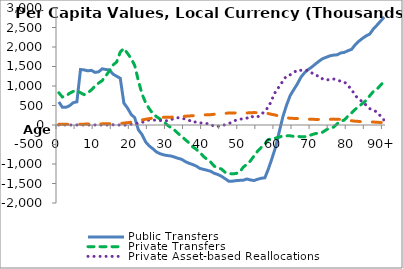
| Category | Public Transfers | Private Transfers | Private Asset-based Reallocations | Public Asset-based Reallocations |
|---|---|---|---|---|
| 0 | 591510.745 | 827219.091 | 1228.666 | 19265.979 |
|  | 453438.7 | 717622.594 | 949.947 | 18915.52 |
| 2 | 453441.687 | 745146.262 | 1680.346 | 18565.062 |
| 3 | 496251.539 | 815200.626 | 458.988 | 18569.931 |
| 4 | 573425.384 | 862192.798 | -521.039 | 19034.452 |
| 5 | 594321.881 | 872118.874 | 733.826 | 19688.412 |
| 6 | 1423202.572 | 828054.936 | 1423.179 | 20755.468 |
| 7 | 1412835.969 | 777860.551 | 1323.464 | 22152.055 |
| 8 | 1389034.735 | 826885.591 | 1103.481 | 23550.649 |
| 9 | 1401688.899 | 898584.385 | 1303.364 | 24806.159 |
| 10 | 1349345.191 | 996393.827 | 1678.179 | 26003.47 |
| 11 | 1363174.714 | 1075064.393 | 1464.291 | 27374.295 |
| 12 | 1440010.84 | 1138079.403 | 1002.726 | 28863.767 |
| 13 | 1423648.635 | 1259800.192 | 1477.637 | 30517.386 |
| 14 | 1411134.992 | 1389021.705 | 1778.967 | 32228.867 |
| 15 | 1303995.743 | 1538645.946 | 5637.399 | 34118.607 |
| 16 | 1249918.46 | 1615219.515 | -600.751 | 35954.27 |
| 17 | 1196814.453 | 1870752.507 | 953.216 | 40655.926 |
| 18 | 561288.224 | 1962478.87 | -7631.971 | 48994.54 |
| 19 | 435698.447 | 1836969.939 | 7771.545 | 59619.875 |
| 20 | 273894.974 | 1707030.205 | 23935.672 | 72928.651 |
| 21 | 184674.938 | 1525168.446 | 22928.021 | 91057.534 |
| 22 | -119870.314 | 1137733.633 | 51701.324 | 109721.519 |
| 23 | -243612.508 | 798774.48 | 69521.944 | 129054.666 |
| 24 | -432844.753 | 574353.492 | 94279.846 | 147141.815 |
| 25 | -535557.997 | 417659.941 | 130933.053 | 163180.956 |
| 26 | -608219.359 | 294793.349 | 123778.489 | 176127.634 |
| 27 | -690808.6 | 215152.782 | 126643.966 | 185474.415 |
| 28 | -735781.725 | 153220.193 | 112243.536 | 191401.584 |
| 29 | -765245.301 | 80438.547 | 124336.676 | 196172.775 |
| 30 | -782950.198 | -562.515 | 104556.697 | 199111.784 |
| 31 | -794443.423 | -65938.484 | 135255.328 | 201103.909 |
| 32 | -822476.818 | -130236.727 | 173229.023 | 205697.058 |
| 33 | -854071.445 | -216720.883 | 185332.888 | 210886.165 |
| 34 | -880788.116 | -293408.357 | 177194.608 | 215305.158 |
| 35 | -938618.683 | -377107.717 | 150797.504 | 224531.819 |
| 36 | -980786.667 | -456064.403 | 123812.944 | 231588.055 |
| 37 | -1012714.061 | -556964.456 | 68266.228 | 236823.831 |
| 38 | -1052236.098 | -620619.471 | 80048.337 | 243189.093 |
| 39 | -1112262.909 | -703707.248 | 50309.776 | 252663.137 |
| 40 | -1137229.565 | -803799.687 | 55471.264 | 257527.719 |
| 41 | -1159839.488 | -881321.888 | 34659.892 | 261151.06 |
| 42 | -1186883.566 | -952057.537 | 16463.408 | 265609.437 |
| 43 | -1239132.471 | -1056038.564 | -36077.398 | 274447.063 |
| 44 | -1269621.02 | -1097929.409 | -34557.969 | 280044.829 |
| 45 | -1315967.071 | -1129592 | -16105.367 | 287841.771 |
| 46 | -1376290.555 | -1211991.962 | 7238.246 | 297910.608 |
| 47 | -1441049.409 | -1246058.119 | 37666.017 | 308777.004 |
| 48 | -1440470.438 | -1253588.181 | 72523.364 | 310361.687 |
| 49 | -1427020.946 | -1243334.871 | 124959.58 | 309944.909 |
| 50 | -1419802.361 | -1211450.734 | 147810.618 | 310650.971 |
| 51 | -1415885.749 | -1083484.09 | 160640.791 | 311719.087 |
| 52 | -1384961.116 | -1008429.402 | 173489.213 | 308770.16 |
| 53 | -1408469.222 | -920554.806 | 233191.985 | 314254.479 |
| 54 | -1423395.647 | -791888.429 | 195640.259 | 318438.085 |
| 55 | -1391141.27 | -668783.821 | 211177.593 | 315566.744 |
| 56 | -1364859.199 | -573070.738 | 260378.041 | 314487.302 |
| 57 | -1353557.046 | -484553.046 | 372212.883 | 314709.141 |
| 58 | -1120005.963 | -369356.225 | 455301.689 | 291561.826 |
| 59 | -846452.385 | -362792.388 | 666246.19 | 271295.121 |
| 60 | -555275.014 | -334013.245 | 866740.723 | 253717.936 |
| 61 | -160577.292 | -311505.991 | 988422.821 | 223376.917 |
| 62 | 218653.822 | -279692.586 | 1130844.748 | 197754.387 |
| 63 | 509760.403 | -278446.776 | 1261646.076 | 184054.456 |
| 64 | 756045.622 | -277112.226 | 1287186.419 | 172739.204 |
| 65 | 908379.672 | -292281.217 | 1347185.804 | 168874.307 |
| 66 | 1055909.851 | -291669.536 | 1411813.486 | 164480.952 |
| 67 | 1230551.84 | -302259.118 | 1401141.421 | 157762.716 |
| 68 | 1342220.632 | -302527.696 | 1406942.676 | 153470.745 |
| 69 | 1422746.313 | -280386.326 | 1397716.797 | 149033.886 |
| 70 | 1488922.1 | -248262.169 | 1334050.433 | 146312.535 |
| 71 | 1565069.181 | -218745.193 | 1268514.889 | 143247.506 |
| 72 | 1638362.078 | -205766.913 | 1258308.634 | 143196.327 |
| 73 | 1701669.886 | -182913.592 | 1176755.109 | 144942.339 |
| 74 | 1737604.046 | -121269.72 | 1152594.701 | 147254.368 |
| 75 | 1774958.899 | -76055.999 | 1169367.217 | 146862.869 |
| 76 | 1791800.752 | -55075.416 | 1180451.33 | 150861.946 |
| 77 | 1799917.082 | 30790.937 | 1152833.688 | 149023.196 |
| 78 | 1848077.5 | 98960.076 | 1121127.352 | 140352.56 |
| 79 | 1862191.615 | 129047.311 | 1103617.273 | 135187.498 |
| 80 | 1906030.783 | 231023.963 | 1007626.378 | 120874.321 |
| 81 | 1941112.147 | 311236.952 | 910396.013 | 108513.604 |
| 82 | 2059410.547 | 401632.484 | 749762.836 | 97485.001 |
| 83 | 2148657.417 | 475642.326 | 672057.71 | 91411.859 |
| 84 | 2222156.06 | 552638.638 | 589234.754 | 80980.499 |
| 85 | 2284167.915 | 629105.164 | 510887.434 | 81731.248 |
| 86 | 2332083.301 | 748381.735 | 419421.594 | 76817.862 |
| 87 | 2461144.092 | 858478.324 | 380886.643 | 76930.855 |
| 88 | 2559526.301 | 920803.454 | 331372.596 | 69995.875 |
| 89 | 2663246.203 | 1019531.722 | 226008.201 | 64443.871 |
| 90+ | 2766966.105 | 1118259.99 | 120643.806 | 58891.868 |